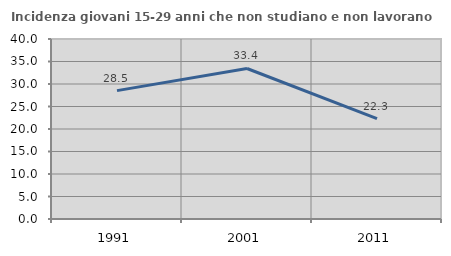
| Category | Incidenza giovani 15-29 anni che non studiano e non lavorano  |
|---|---|
| 1991.0 | 28.53 |
| 2001.0 | 33.447 |
| 2011.0 | 22.305 |